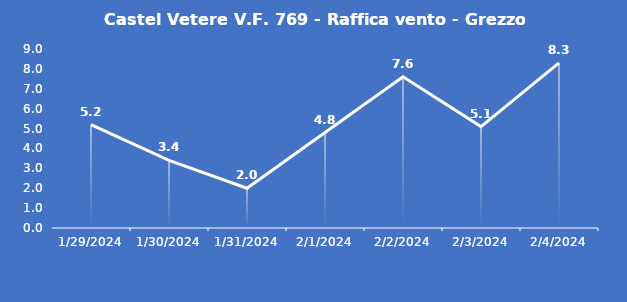
| Category | Castel Vetere V.F. 769 - Raffica vento - Grezzo (m/s) |
|---|---|
| 1/29/24 | 5.2 |
| 1/30/24 | 3.4 |
| 1/31/24 | 2 |
| 2/1/24 | 4.8 |
| 2/2/24 | 7.6 |
| 2/3/24 | 5.1 |
| 2/4/24 | 8.3 |